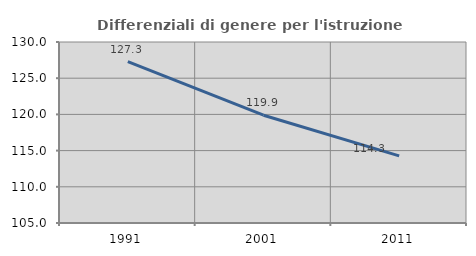
| Category | Differenziali di genere per l'istruzione superiore |
|---|---|
| 1991.0 | 127.283 |
| 2001.0 | 119.889 |
| 2011.0 | 114.279 |